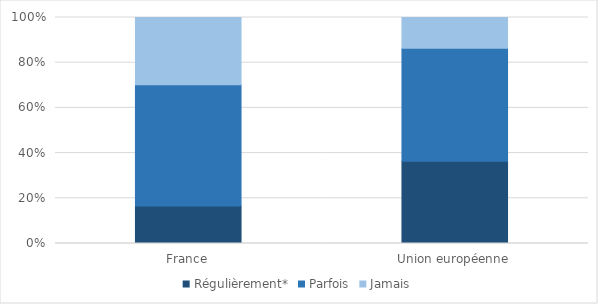
| Category | Régulièrement* | Parfois | Jamais |
|---|---|---|---|
| France | 16.6 | 53.6 | 29.8 |
| Union européenne | 36.4 | 50 | 13.6 |